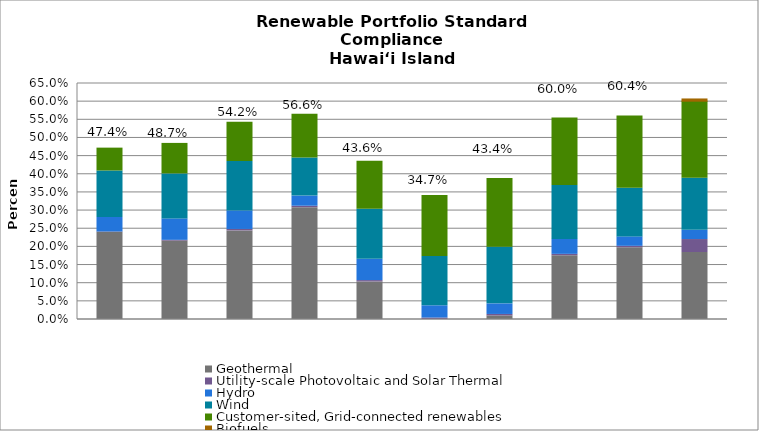
| Category | Geothermal | Utility-scale Photovoltaic and Solar Thermal | Hydro | Wind | Customer-sited, Grid-connected renewables | Biofuels |
|---|---|---|---|---|---|---|
| 2014.0 | 0.24 | 0.001 | 0.04 | 0.128 | 0.063 | 0 |
| 2015.0 | 0.216 | 0.002 | 0.059 | 0.124 | 0.084 | 0 |
| 2016.0 | 0.244 | 0.004 | 0.051 | 0.136 | 0.108 | 0 |
| 2017.0 | 0.308 | 0.004 | 0.028 | 0.105 | 0.12 | 0 |
| 2018.0 | 0.103 | 0.004 | 0.059 | 0.138 | 0.133 | 0 |
| 2019.0 | 0 | 0.004 | 0.034 | 0.136 | 0.168 | 0 |
| 2020.0 | 0.01 | 0.004 | 0.029 | 0.156 | 0.189 | 0 |
| 2021.0 | 0.176 | 0.004 | 0.041 | 0.148 | 0.186 | 0 |
| 2022.0 | 0.198 | 0.004 | 0.026 | 0.134 | 0.199 | 0 |
| 2023.0 | 0.185 | 0.036 | 0.025 | 0.143 | 0.212 | 0.006 |